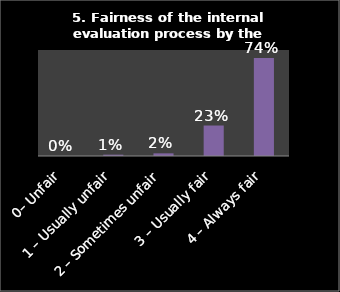
| Category | Series 0 |
|---|---|
| 0– Unfair | 0 |
| 1 – Usually unfair | 0.01 |
| 2 – Sometimes unfair | 0.02 |
| 3 – Usually fair | 0.23 |
| 4 – Always fair | 0.74 |